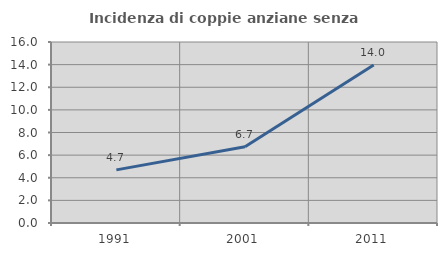
| Category | Incidenza di coppie anziane senza figli  |
|---|---|
| 1991.0 | 4.695 |
| 2001.0 | 6.748 |
| 2011.0 | 13.959 |